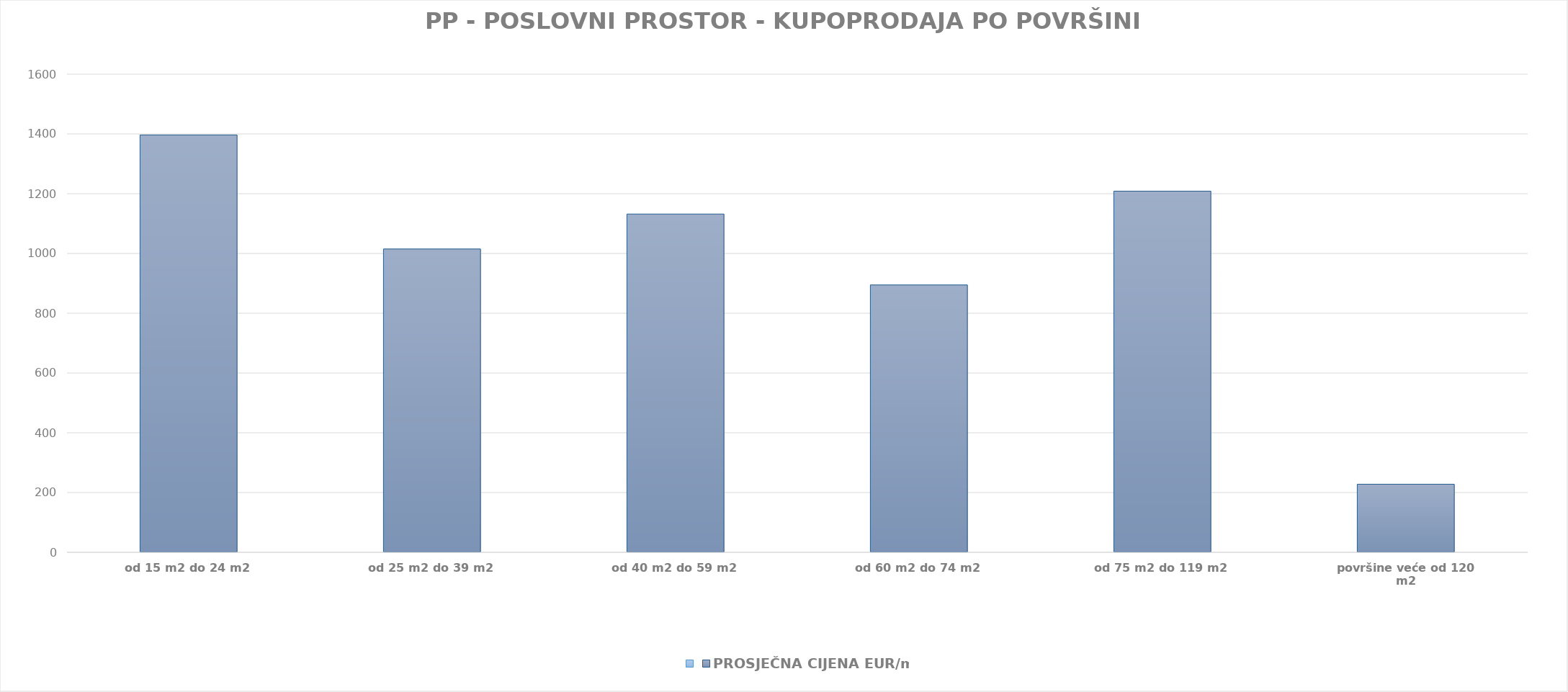
| Category | Series 0 | PROSJEČNA CIJENA EUR/m2 |
|---|---|---|
| od 15 m2 do 24 m2 |  | 1903-10-27 13:46:42 |
| od 25 m2 do 39 m2 |  | 1902-10-11 01:11:14 |
| od 40 m2 do 59 m2 |  | 1903-02-04 22:54:17 |
| od 60 m2 do 74 m2 |  | 1902-06-12 17:08:47 |
| od 75 m2 do 119 m2 |  | 1903-04-22 13:31:56 |
| površine veće od 120 m2 |  | 1900-08-14 20:05:52 |